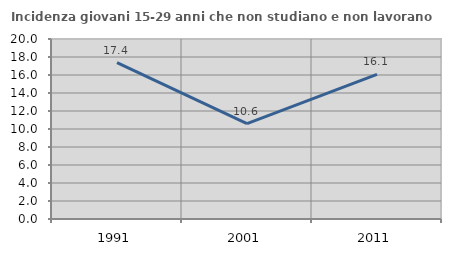
| Category | Incidenza giovani 15-29 anni che non studiano e non lavorano  |
|---|---|
| 1991.0 | 17.37 |
| 2001.0 | 10.594 |
| 2011.0 | 16.078 |